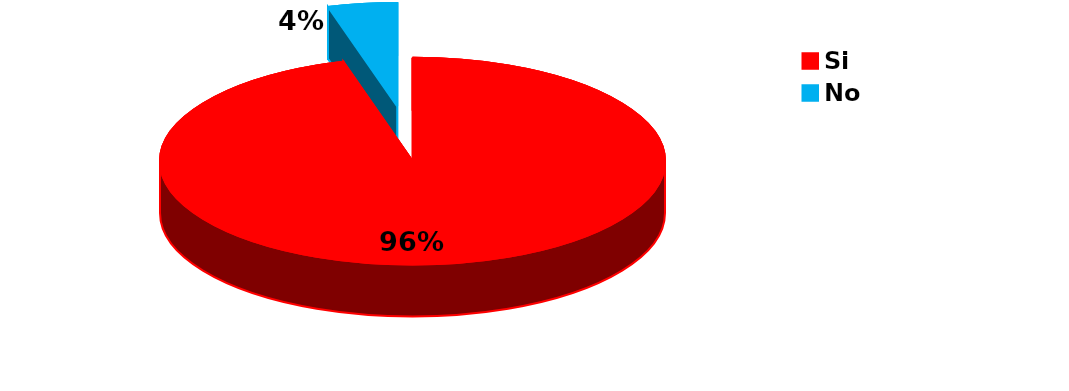
| Category | Series 0 |
|---|---|
| Si | 1103 |
| No | 51 |